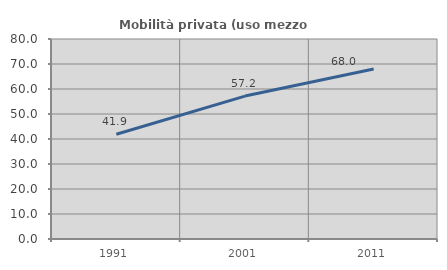
| Category | Mobilità privata (uso mezzo privato) |
|---|---|
| 1991.0 | 41.913 |
| 2001.0 | 57.166 |
| 2011.0 | 68.028 |